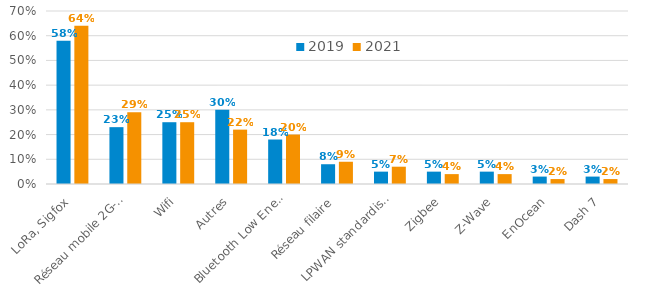
| Category | 2019 | 2021 |
|---|---|---|
| LoRa, Sigfox | 0.58 | 0.64 |
| Réseau mobile 2G-5G | 0.23 | 0.29 |
| Wifi | 0.25 | 0.25 |
| Autres | 0.3 | 0.22 |
| Bluetooth Low Energie | 0.18 | 0.2 |
| Réseau filaire | 0.08 | 0.09 |
| LPWAN standardisés | 0.05 | 0.07 |
| Zigbee | 0.05 | 0.04 |
| Z-Wave | 0.05 | 0.04 |
| EnOcean | 0.03 | 0.02 |
| Dash 7 | 0.03 | 0.02 |